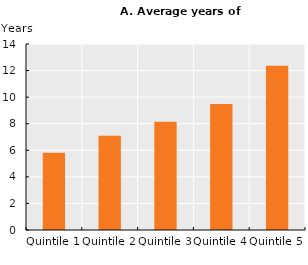
| Category | Average years of education |
|---|---|
| Quintile 1 | 5.812 |
| Quintile 2 | 7.094 |
| Quintile 3 | 8.144 |
| Quintile 4 | 9.481 |
| Quintile 5 | 12.362 |